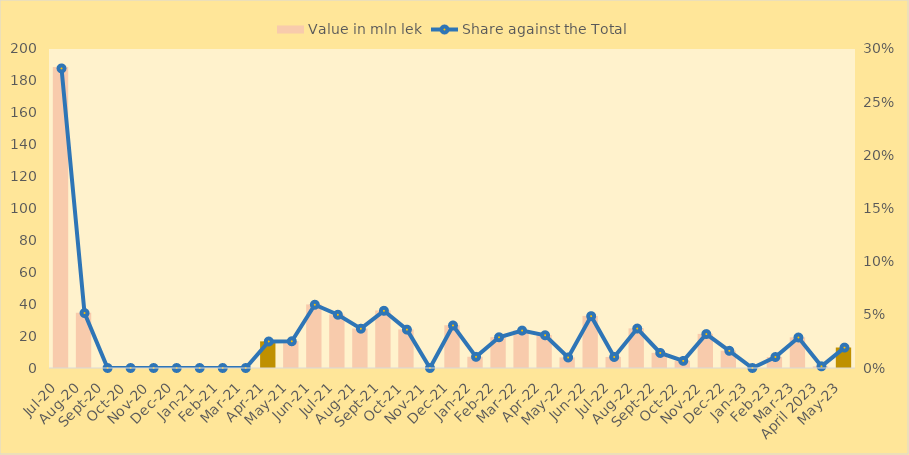
| Category | Value in mln lek |
|---|---|
| Jul-20 | 188.7 |
| Aug-20 | 34.6 |
| Sep-20 | 0 |
| Oct-20 | 0 |
| Nov-20 | 0 |
| Dec-20 | 0 |
| Jan-21 | 0 |
| Feb-21 | 0 |
| Mar-21 | 0 |
| Apr-21 | 16.709 |
| May-21 | 16.827 |
| Jun-21 | 39.848 |
| Jul-21 | 33.536 |
| Aug-21 | 24.753 |
| Sep-21 | 36.031 |
| Oct-21 | 24.173 |
| Nov-21 | 0 |
| Dec-21 | 26.801 |
| Jan-22 | 7.027 |
| Feb-22 | 19.349 |
| Mar-22 | 23.574 |
| Apr-22 | 20.609 |
| May-22 | 6.626 |
| Jun-22 | 32.661 |
| Jul-22 | 6.931 |
| Aug-22 | 24.85 |
| Sep-22 | 9.475 |
| Oct-22 | 4.483 |
| Nov-22 | 21.374 |
| Dec-22 | 10.824 |
| Jan-23 | 0 |
| Feb-23 | 6.911 |
| Mar-23 | 19.201 |
| April 2023 | 1.047 |
| May-23 | 12.847 |